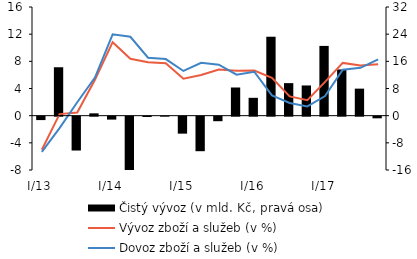
| Category | Čistý vývoz (v mld. Kč, pravá osa) |
|---|---|
| I/13 | -1.008 |
| II | 14.257 |
| III | -9.97 |
| IV | 0.683 |
| I/14 | -0.863 |
| II | -15.705 |
| III | -0.101 |
| IV | 0.001 |
| I/15 | -4.999 |
| II | -10.17 |
| III | -1.337 |
| IV | 8.296 |
| I/16 | 5.256 |
| II | 23.246 |
| III | 9.579 |
| IV | 8.895 |
| I/17 | 20.541 |
| II | 13.603 |
| III | 7.958 |
| IV | -0.485 |